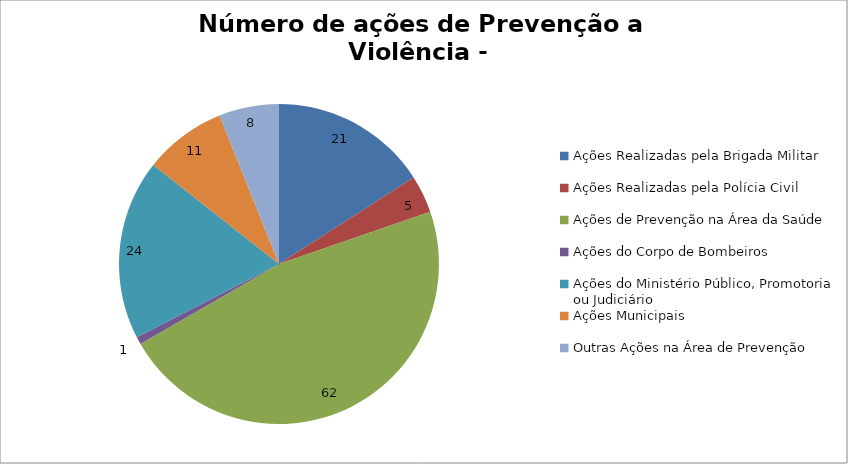
| Category | Número de Ações |
|---|---|
| Ações Realizadas pela Brigada Militar | 21 |
| Ações Realizadas pela Polícia Civil | 5 |
| Ações de Prevenção na Área da Saúde | 62 |
| Ações do Corpo de Bombeiros | 1 |
| Ações do Ministério Público, Promotoria ou Judiciário | 24 |
| Ações Municipais | 11 |
| Outras Ações na Área de Prevenção | 8 |